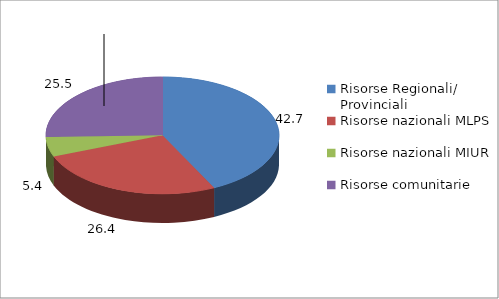
| Category | Series 0 |
|---|---|
| Risorse Regionali/ Provinciali | 42.704 |
| Risorse nazionali MLPS | 26.402 |
| Risorse nazionali MIUR | 5.436 |
| Risorse comunitarie | 25.458 |